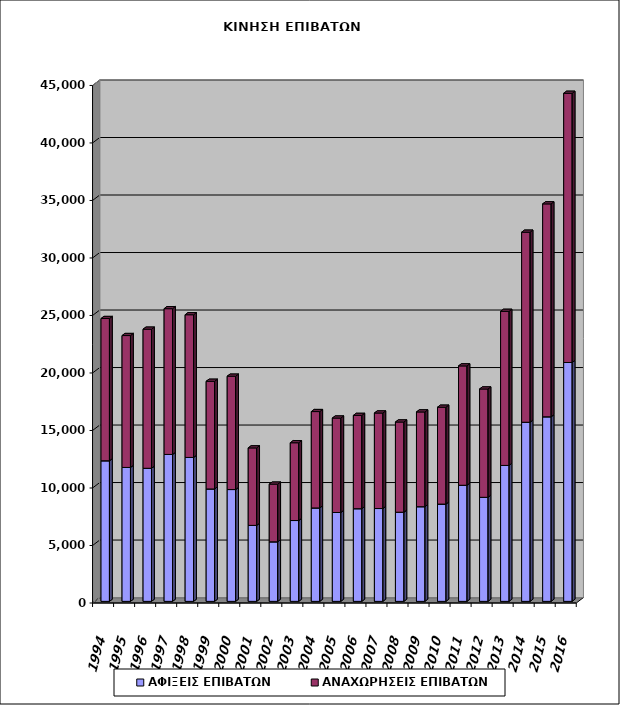
| Category | ΑΦΙΞΕΙΣ ΕΠΙΒΑΤΩΝ | ΑΝΑΧΩΡΗΣΕΙΣ ΕΠΙΒΑΤΩΝ |
|---|---|---|
| 1994.0 | 12224 | 12368 |
| 1995.0 | 11644 | 11468 |
| 1996.0 | 11571 | 12093 |
| 1997.0 | 12774 | 12674 |
| 1998.0 | 12514 | 12407 |
| 1999.0 | 9775 | 9359 |
| 2000.0 | 9723 | 9854 |
| 2001.0 | 6607 | 6736 |
| 2002.0 | 5177 | 5015 |
| 2003.0 | 7029 | 6762 |
| 2004.0 | 8124 | 8378 |
| 2005.0 | 7728 | 8210 |
| 2006.0 | 8057 | 8111 |
| 2007.0 | 8072 | 8305 |
| 2008.0 | 7752 | 7843 |
| 2009.0 | 8231 | 8239 |
| 2010.0 | 8458 | 8422 |
| 2011.0 | 10095 | 10378 |
| 2012.0 | 9046 | 9419 |
| 2013.0 | 11819 | 13397 |
| 2014.0 | 15575 | 16522 |
| 2015.0 | 16048 | 18512 |
| 2016.0 | 20768 | 23406 |